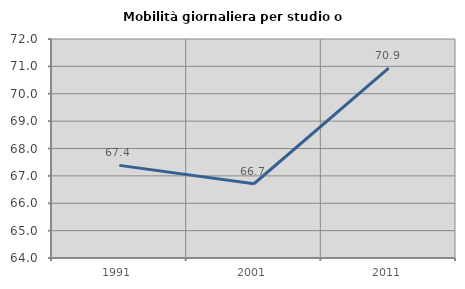
| Category | Mobilità giornaliera per studio o lavoro |
|---|---|
| 1991.0 | 67.384 |
| 2001.0 | 66.712 |
| 2011.0 | 70.94 |